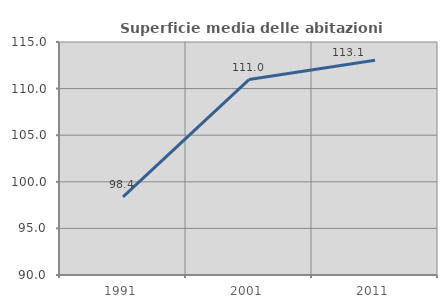
| Category | Superficie media delle abitazioni occupate |
|---|---|
| 1991.0 | 98.385 |
| 2001.0 | 110.97 |
| 2011.0 | 113.052 |